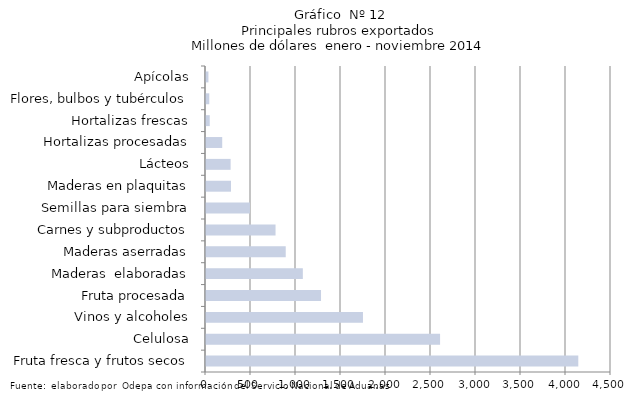
| Category | Series 7 |
|---|---|
| Fruta fresca y frutos secos | 4136584.297 |
| Celulosa | 2600777.395 |
| Vinos y alcoholes | 1744070.536 |
| Fruta procesada | 1277842.723 |
| Maderas  elaboradas | 1075987.378 |
| Maderas aserradas | 885816.136 |
| Carnes y subproductos | 772640.185 |
| Semillas para siembra | 488254.362 |
| Maderas en plaquitas | 277732.322 |
| Lácteos | 273479.29 |
| Hortalizas procesadas | 180106.461 |
| Hortalizas frescas | 41584.417 |
| Flores, bulbos y tubérculos | 36274.545 |
| Apícolas | 26890.929 |